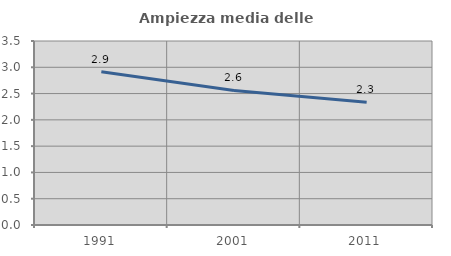
| Category | Ampiezza media delle famiglie |
|---|---|
| 1991.0 | 2.915 |
| 2001.0 | 2.56 |
| 2011.0 | 2.333 |